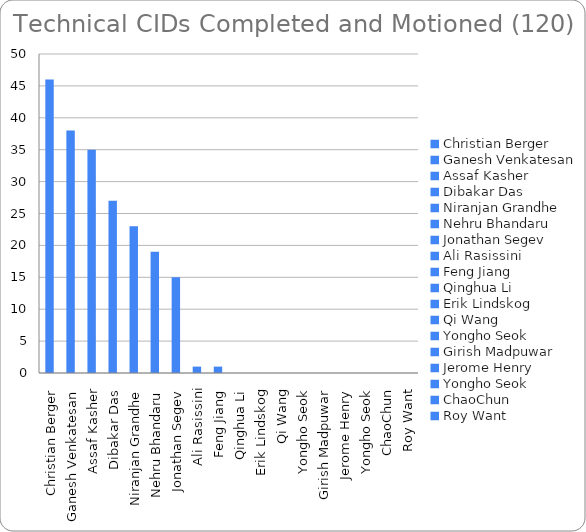
| Category | Series 0 |
|---|---|
| Christian Berger | 46 |
| Ganesh Venkatesan | 38 |
| Assaf Kasher | 35 |
| Dibakar Das | 27 |
| Niranjan Grandhe | 23 |
| Nehru Bhandaru | 19 |
| Jonathan Segev | 15 |
| Ali Rasissini | 1 |
| Feng Jiang | 1 |
| Qinghua Li | 0 |
| Erik Lindskog | 0 |
| Qi Wang | 0 |
| Yongho Seok | 0 |
| Girish Madpuwar | 0 |
| Jerome Henry | 0 |
| Yongho Seok | 0 |
| ChaoChun | 0 |
| Roy Want | 0 |